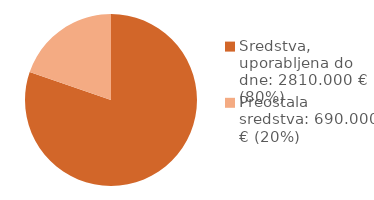
| Category | Series 0 |
|---|---|
| Sredstva, uporabljena do dne: 2810.000 € (80%) | 2810 |
| Preostala sredstva: 690.000 € (20%) | 690 |